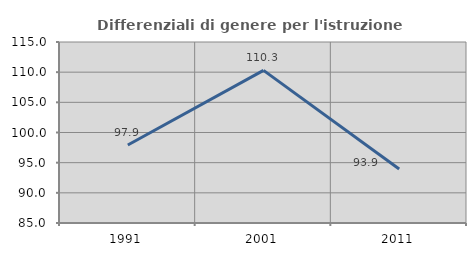
| Category | Differenziali di genere per l'istruzione superiore |
|---|---|
| 1991.0 | 97.921 |
| 2001.0 | 110.299 |
| 2011.0 | 93.95 |